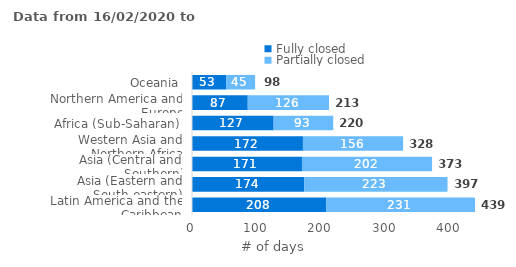
| Category | Fully closed | Partially closed | Series 2 |
|---|---|---|---|
| Latin America and the Caribbean | 208.439 | 230.829 | 439.268 |
| Asia (Eastern and South-eastern) | 174 | 222.812 | 396.812 |
| Asia (Central and Southern) | 170.643 | 202.143 | 372.786 |
| Western Asia and Northern Africa | 172.125 | 155.792 | 327.917 |
| Africa (Sub-Saharan) | 126.688 | 92.812 | 219.5 |
| Northern America and Europe | 86.52 | 126.24 | 212.76 |
| Oceania | 53 | 45.235 | 98.235 |